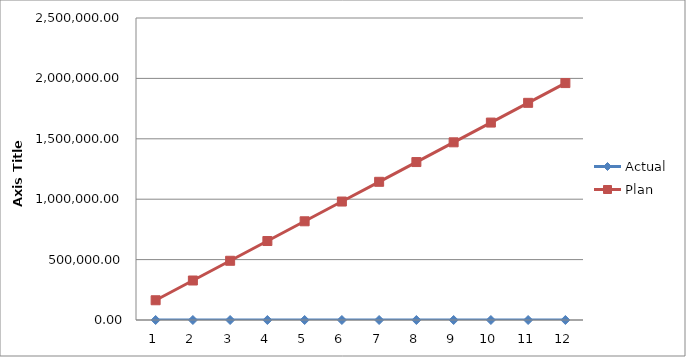
| Category | Actual | Plan |
|---|---|---|
| 0 | 0 | 163430.25 |
| 1 | 0 | 326860.5 |
| 2 | 0 | 490290.75 |
| 3 | 0 | 653721 |
| 4 | 0 | 817151.25 |
| 5 | 0 | 980581.5 |
| 6 | 0 | 1144011.75 |
| 7 | 0 | 1307442 |
| 8 | 0 | 1470872.25 |
| 9 | 0 | 1634302.5 |
| 10 | 0 | 1797732.75 |
| 11 | 0 | 1961163 |